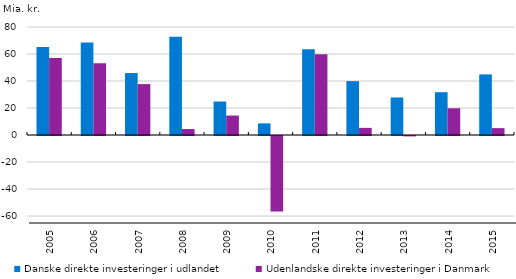
| Category | Danske direkte investeringer i udlandet | Udenlandske direkte investeringer i Danmark |
|---|---|---|
| 2005.0 | 65.1 | 57.1 |
| 2006.0 | 68.5 | 53.1 |
| 2007.0 | 45.9 | 37.7 |
| 2008.0 | 72.7 | 4.4 |
| 2009.0 | 24.8 | 14.4 |
| 2010.0 | 8.6 | -55.9 |
| 2011.0 | 63.6 | 59.8 |
| 2012.0 | 39.9 | 5.3 |
| 2013.0 | 27.8 | -0.3 |
| 2014.0 | 31.7 | 19.8 |
| 2015.0 | 44.9 | 5.1 |